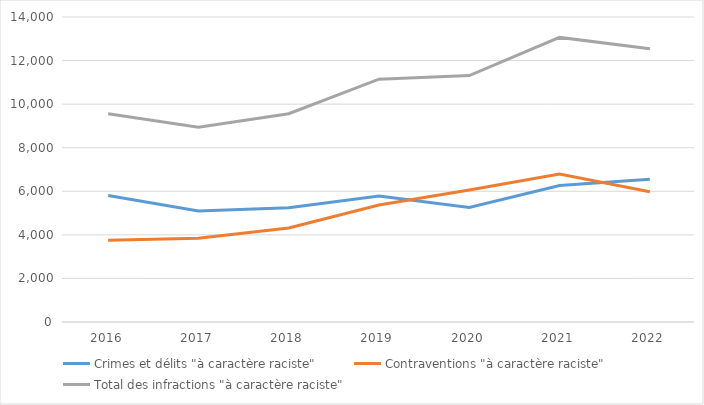
| Category | Crimes et délits "à caractère raciste" | Contraventions "à caractère raciste" | Total des infractions "à caractère raciste" |
|---|---|---|---|
| 2016.0 | 5803 | 3755 | 9558 |
| 2017.0 | 5092 | 3844 | 8936 |
| 2018.0 | 5248 | 4312 | 9560 |
| 2019.0 | 5779 | 5368 | 11147 |
| 2020.0 | 5255 | 6057 | 11312 |
| 2021.0 | 6267 | 6797 | 13064 |
| 2022.0 | 6555 | 5983 | 12538 |